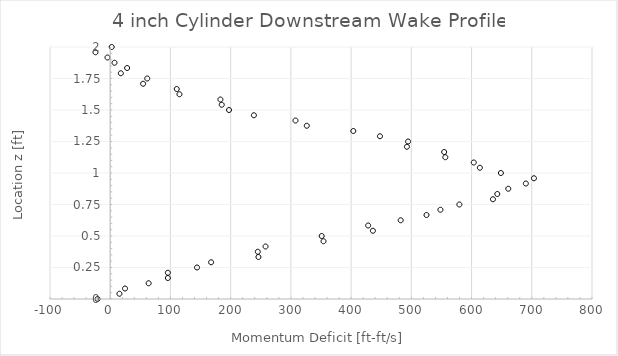
| Category | Series 0 |
|---|---|
| -20.95199753406701 | 0 |
| 15.283425722170332 | 0.042 |
| 24.575068621622993 | 0.083 |
| 63.78592630756078 | 0.125 |
| 95.73047883730054 | 0.167 |
| 95.73047883730054 | 0.208 |
| 144.15619034460448 | 0.25 |
| 167.51869936058864 | 0.292 |
| 246.115973357522 | 0.333 |
| 245.0408246096539 | 0.375 |
| 257.9110102705381 | 0.417 |
| 354.1980448937735 | 0.458 |
| 351.1274870216491 | 0.5 |
| 436.18582095090807 | 0.542 |
| 428.357315917591 | 0.583 |
| 482.3386197866305 | 0.625 |
| 525.1895836283701 | 0.667 |
| 548.3292678184843 | 0.708 |
| 579.7745210645589 | 0.75 |
| 635.534955575282 | 0.792 |
| 642.7289936944426 | 0.833 |
| 660.9841223173194 | 0.875 |
| 690.1491970151675 | 0.917 |
| 703.6147971464003 | 0.958 |
| 648.7282880308036 | 1 |
| 613.8250564464907 | 1.042 |
| 603.6609175843735 | 1.083 |
| 556.4766346972943 | 1.125 |
| 554.5123454307861 | 1.167 |
| 492.71170184804924 | 1.208 |
| 494.58933096686957 | 1.25 |
| 447.85669167028834 | 1.292 |
| 403.6509320129876 | 1.333 |
| 326.3906110391054 | 1.375 |
| 307.6404239181667 | 1.417 |
| 238.5799460835349 | 1.458 |
| 197.27012980889816 | 1.5 |
| 185.1885468140263 | 1.542 |
| 182.98604981045693 | 1.583 |
| 114.96844925761398 | 1.625 |
| 110.45268625377705 | 1.667 |
| 54.60088594452886 | 1.708 |
| 61.49205951361681 | 1.75 |
| 17.60864703177529 | 1.792 |
| 28.053061787640313 | 1.833 |
| 7.133079989191703 | 1.875 |
| -4.542642963027328 | 1.917 |
| -24.477818865417866 | 1.958 |
| 2.467344614898199 | 2 |